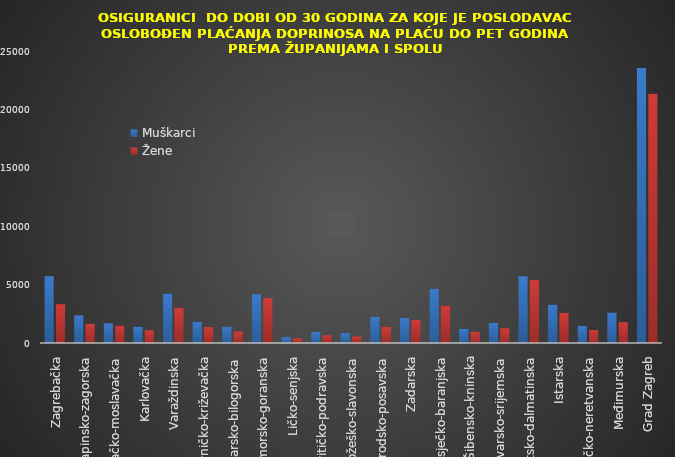
| Category | Muškarci | Žene |
|---|---|---|
| Zagrebačka | 5717 | 3324 |
| Krapinsko-zagorska | 2371 | 1645 |
| Sisačko-moslavačka | 1680 | 1486 |
| Karlovačka | 1387 | 1088 |
| Varaždinska | 4237 | 3014 |
| Koprivničko-križevačka | 1808 | 1362 |
| Bjelovarsko-bilogorska | 1397 | 986 |
| Primorsko-goranska | 4178 | 3840 |
| Ličko-senjska | 499 | 395 |
| Virovitičko-podravska | 940 | 662 |
| Požeško-slavonska | 847 | 561 |
| Brodsko-posavska | 2240 | 1390 |
| Zadarska | 2135 | 1975 |
| Osječko-baranjska | 4632 | 3188 |
| Šibensko-kninska | 1205 | 951 |
| Vukovarsko-srijemska | 1714 | 1256 |
| Splitsko-dalmatinska | 5714 | 5393 |
| Istarska | 3279 | 2569 |
| Dubrovačko-neretvanska | 1447 | 1114 |
| Međimurska | 2604 | 1786 |
| Grad Zagreb | 23543 | 21347 |